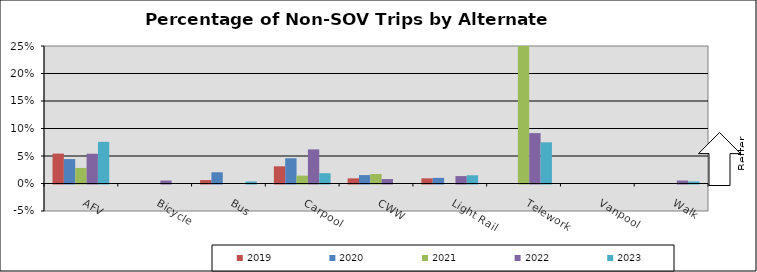
| Category | 2019 | 2020 | 2021 | 2022 | 2023 |
|---|---|---|---|---|---|
| AFV | 0.054 | 0.044 | 0.028 | 0.054 | 0.076 |
| Bicycle | 0 | 0 | 0 | 0.005 | 0 |
| Bus | 0.006 | 0.02 | 0 | 0 | 0.004 |
| Carpool | 0.031 | 0.046 | 0.014 | 0.062 | 0.019 |
| CWW | 0.009 | 0.015 | 0.017 | 0.008 | 0 |
| Light Rail | 0.009 | 0.01 | 0 | 0.013 | 0.015 |
| Telework | 0 | 0 | 0.438 | 0.092 | 0.075 |
| Vanpool | 0 | 0 | 0 | 0 | 0 |
| Walk | 0 | 0 | 0 | 0.005 | 0.004 |